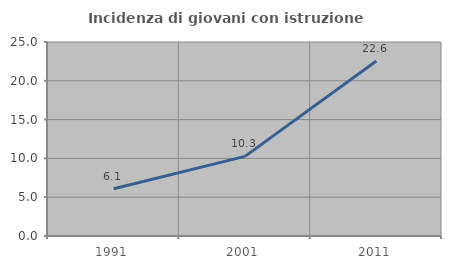
| Category | Incidenza di giovani con istruzione universitaria |
|---|---|
| 1991.0 | 6.087 |
| 2001.0 | 10.256 |
| 2011.0 | 22.56 |